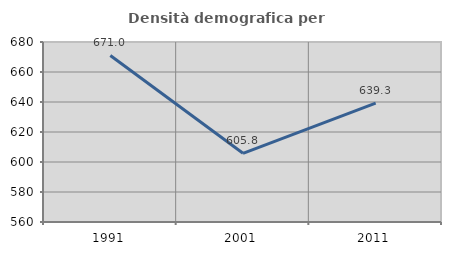
| Category | Densità demografica |
|---|---|
| 1991.0 | 671.038 |
| 2001.0 | 605.813 |
| 2011.0 | 639.266 |